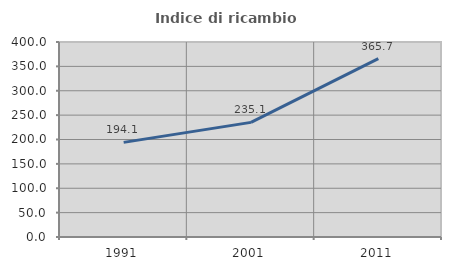
| Category | Indice di ricambio occupazionale  |
|---|---|
| 1991.0 | 194.118 |
| 2001.0 | 235.135 |
| 2011.0 | 365.714 |